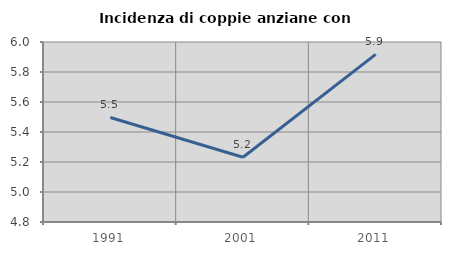
| Category | Incidenza di coppie anziane con figli |
|---|---|
| 1991.0 | 5.497 |
| 2001.0 | 5.232 |
| 2011.0 | 5.918 |